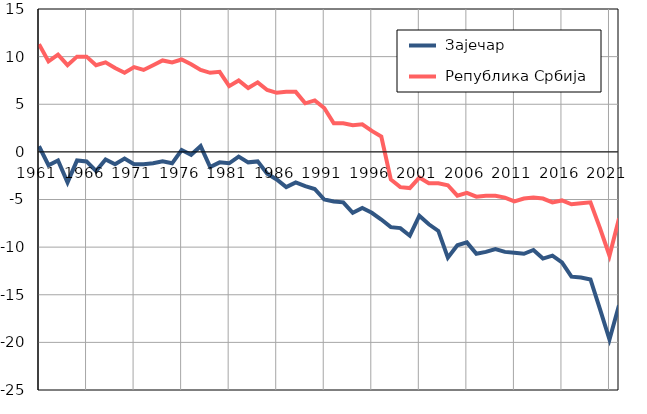
| Category |  Зајечар |  Република Србија |
|---|---|---|
| 1961.0 | 0.6 | 11.3 |
| 1962.0 | -1.4 | 9.5 |
| 1963.0 | -0.9 | 10.2 |
| 1964.0 | -3.2 | 9.1 |
| 1965.0 | -0.9 | 10 |
| 1966.0 | -1 | 10 |
| 1967.0 | -2 | 9.1 |
| 1968.0 | -0.8 | 9.4 |
| 1969.0 | -1.3 | 8.8 |
| 1970.0 | -0.7 | 8.3 |
| 1971.0 | -1.3 | 8.9 |
| 1972.0 | -1.3 | 8.6 |
| 1973.0 | -1.2 | 9.1 |
| 1974.0 | -1 | 9.6 |
| 1975.0 | -1.2 | 9.4 |
| 1976.0 | 0.2 | 9.7 |
| 1977.0 | -0.3 | 9.2 |
| 1978.0 | 0.6 | 8.6 |
| 1979.0 | -1.6 | 8.3 |
| 1980.0 | -1.1 | 8.4 |
| 1981.0 | -1.2 | 6.9 |
| 1982.0 | -0.5 | 7.5 |
| 1983.0 | -1.1 | 6.7 |
| 1984.0 | -1 | 7.3 |
| 1985.0 | -2.3 | 6.5 |
| 1986.0 | -2.9 | 6.2 |
| 1987.0 | -3.7 | 6.3 |
| 1988.0 | -3.2 | 6.3 |
| 1989.0 | -3.6 | 5.1 |
| 1990.0 | -3.9 | 5.4 |
| 1991.0 | -5 | 4.6 |
| 1992.0 | -5.2 | 3 |
| 1993.0 | -5.3 | 3 |
| 1994.0 | -6.4 | 2.8 |
| 1995.0 | -5.9 | 2.9 |
| 1996.0 | -6.4 | 2.2 |
| 1997.0 | -7.1 | 1.6 |
| 1998.0 | -7.9 | -2.9 |
| 1999.0 | -8 | -3.7 |
| 2000.0 | -8.8 | -3.8 |
| 2001.0 | -6.7 | -2.7 |
| 2002.0 | -7.6 | -3.3 |
| 2003.0 | -8.3 | -3.3 |
| 2004.0 | -11.1 | -3.5 |
| 2005.0 | -9.8 | -4.6 |
| 2006.0 | -9.5 | -4.3 |
| 2007.0 | -10.7 | -4.7 |
| 2008.0 | -10.5 | -4.6 |
| 2009.0 | -10.2 | -4.6 |
| 2010.0 | -10.5 | -4.8 |
| 2011.0 | -10.6 | -5.2 |
| 2012.0 | -10.7 | -4.9 |
| 2013.0 | -10.3 | -4.8 |
| 2014.0 | -11.2 | -4.9 |
| 2015.0 | -10.9 | -5.3 |
| 2016.0 | -11.6 | -5.1 |
| 2017.0 | -13.1 | -5.5 |
| 2018.0 | -13.2 | -5.4 |
| 2019.0 | -13.4 | -5.3 |
| 2020.0 | -16.5 | -8 |
| 2021.0 | -19.7 | -10.9 |
| 2022.0 | -16.1 | -7 |